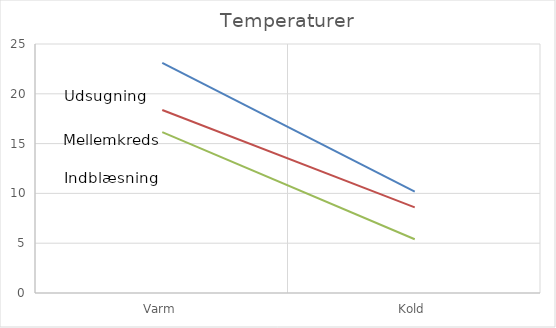
| Category | Series 0 | Series 1 | Series 2 |
|---|---|---|---|
| Varm | 23.1 | 18.371 | 16.156 |
| Kold | 10.173 | 8.602 | 5.4 |